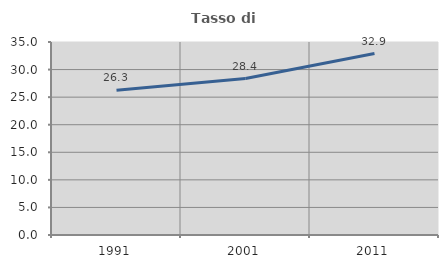
| Category | Tasso di occupazione   |
|---|---|
| 1991.0 | 26.257 |
| 2001.0 | 28.374 |
| 2011.0 | 32.91 |